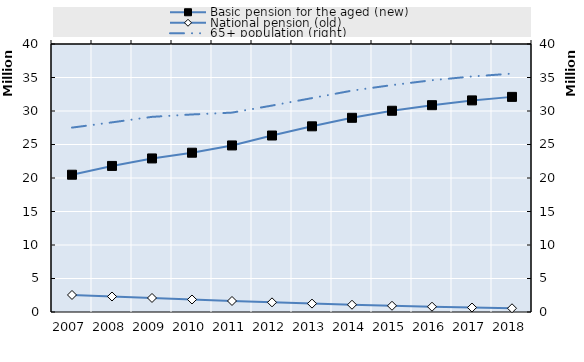
| Category | Basic pension for the aged (new) | National pension (old) | Series 4 | Series 5 | Series 6 | Series 7 | Series 8 | Series 9 | Series 10 | Series 11 | Series 12 | Series 14 | Series 15 | Series 16 | Series 17 | Series 18 | Series 19 |
|---|---|---|---|---|---|---|---|---|---|---|---|---|---|---|---|---|---|
| 2007.0 | 20487842 | 2543190 |  |  |  |  |  |  |  |  |  |  |  |  |  |  |  |
| 2008.0 | 21801311 | 2309901 |  |  |  |  |  |  |  |  |  |  |  |  |  |  |  |
| 2009.0 | 22918980 | 2095889 |  |  |  |  |  |  |  |  |  |  |  |  |  |  |  |
| 2010.0 | 23775499 | 1866095 |  |  |  |  |  |  |  |  |  |  |  |  |  |  |  |
| 2011.0 | 24858322 | 1645901 |  |  |  |  |  |  |  |  |  |  |  |  |  |  |  |
| 2012.0 | 26340766 | 1440801 |  |  |  |  |  |  |  |  |  |  |  |  |  |  |  |
| 2013.0 | 27714205 | 1253688 |  |  |  |  |  |  |  |  |  |  |  |  |  |  |  |
| 2014.0 | 28985397 | 1083655 |  |  |  |  |  |  |  |  |  |  |  |  |  |  |  |
| 2015.0 | 30035940 | 928351 |  |  |  |  |  |  |  |  |  |  |  |  |  |  |  |
| 2016.0 | 30867744 | 789028 |  |  |  |  |  |  |  |  |  |  |  |  |  |  |  |
| 2017.0 | 31581790 | 665697 |  |  |  |  |  |  |  |  |  |  |  |  |  |  |  |
| 2018.0 | 32108121 | 556327 |  |  |  |  |  |  |  |  |  |  |  |  |  |  |  |